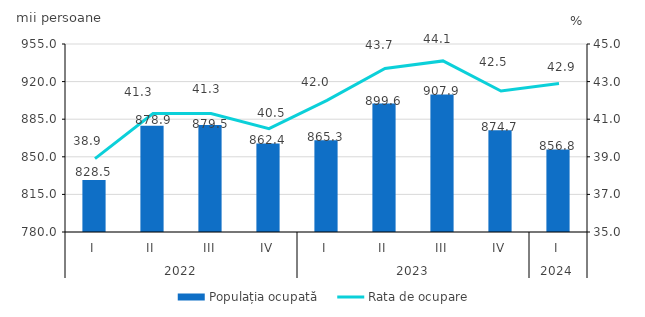
| Category | Populația ocupată |
|---|---|
| 0 | 828.5 |
| 1 | 878.9 |
| 2 | 879.5 |
| 3 | 862.4 |
| 4 | 865.3 |
| 5 | 899.6 |
| 6 | 907.9 |
| 7 | 874.7 |
| 8 | 856.8 |